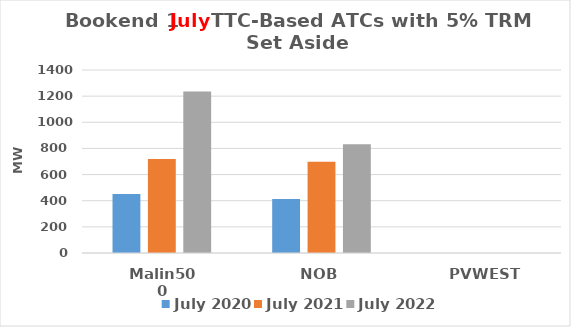
| Category | July 2020 | July 2021 | July 2022 |
|---|---|---|---|
| Malin500 | 450.72 | 719.04 | 1235 |
| NOB | 412.32 | 697.2 | 832.9 |
| PVWEST | 0 | 0 | 0 |